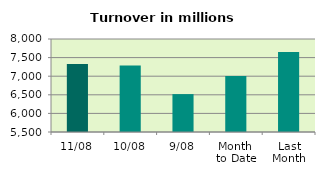
| Category | Series 0 |
|---|---|
| 11/08 | 7330.829 |
| 10/08 | 7290.419 |
| 9/08 | 6518.547 |
| Month 
to Date | 7003.777 |
| Last
Month | 7648.819 |